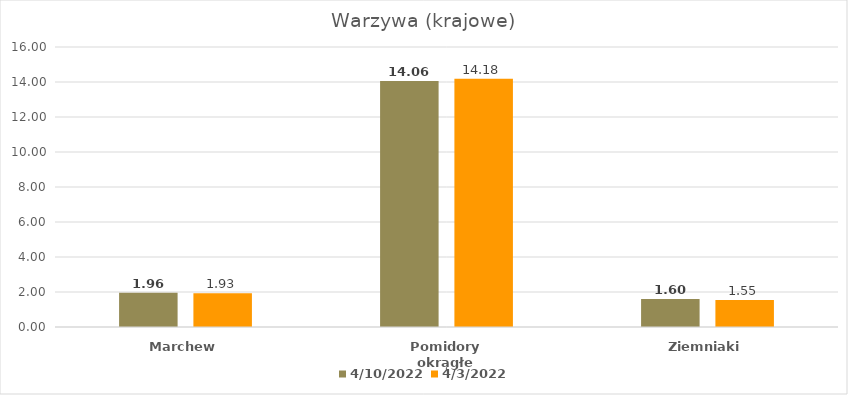
| Category | 10.04.2022 | 03.04.2022 |
|---|---|---|
| Marchew | 1.96 | 1.93 |
| Pomidory okrągłe | 14.06 | 14.18 |
| Ziemniaki | 1.6 | 1.55 |